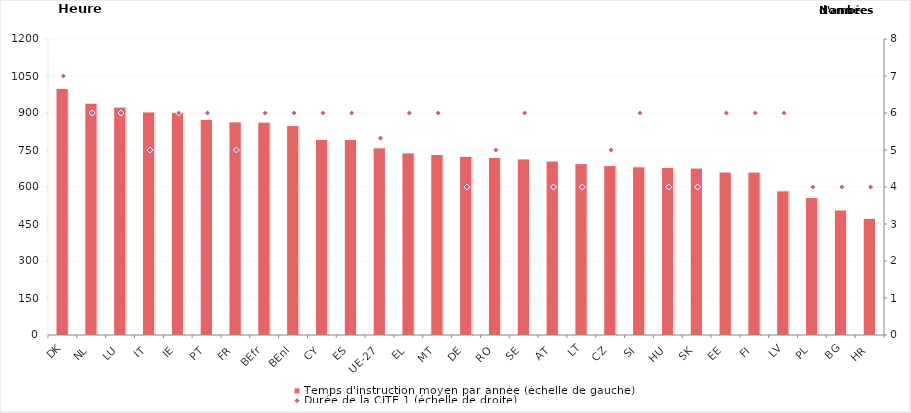
| Category | Temps d'instruction moyen par année (échelle de gauche) |
|---|---|
| DK | 1000 |
| NL | 940 |
| LU | 924 |
| IT | 904.2 |
| IE | 903 |
| PT | 874 |
| FR | 864 |
| BEfr | 863 |
| BEnl | 849 |
| CY | 793 |
| ES | 792.5 |
| UE-27 | 758.664 |
| EL | 738.333 |
| MT | 731.83 |
| DE | 724 |
| RO | 720 |
| SE | 713.833 |
| AT | 705 |
| LT | 694.75 |
| CZ | 687 |
| SI | 681.833 |
| HU | 679.5 |
| SK | 676.75 |
| EE | 660.667 |
| FI | 660.333 |
| LV | 584.33 |
| PL | 557.5 |
| BG | 507 |
| HR | 473 |